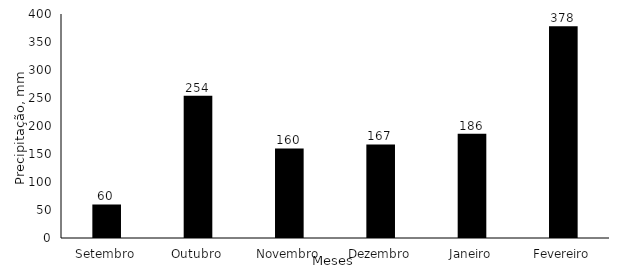
| Category | Precitação, mm |
|---|---|
| Setembro | 60 |
| Outubro | 254 |
| Novembro | 160 |
| Dezembro | 167 |
| Janeiro | 186 |
| Fevereiro | 378 |